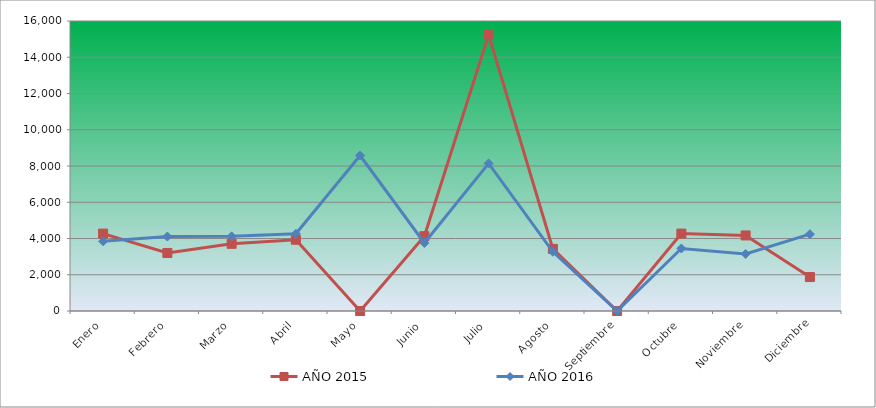
| Category | AÑO 2015 | AÑO 2016 |
|---|---|---|
| Enero | 4271.933 | 3844.653 |
| Febrero | 3201.376 | 4107.709 |
| Marzo | 3705.773 | 4117.826 |
| Abril | 3932.237 | 4259.471 |
| Mayo | 0 | 8579.647 |
| Junio | 4127.819 | 3753.596 |
| Julio | 15234.844 | 8144.595 |
| Agosto | 3427.84 | 3267.955 |
| Septiembre | 0 | 0 |
| Octubre | 4271.933 | 3450.071 |
| Noviembre | 4168.995 | 3146.545 |
| Diciembre | 1873.474 | 4239.236 |